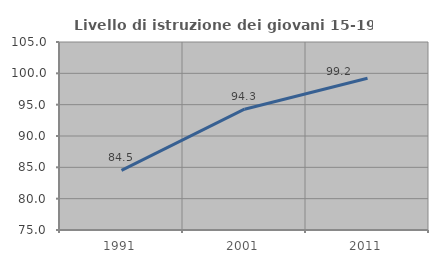
| Category | Livello di istruzione dei giovani 15-19 anni |
|---|---|
| 1991.0 | 84.505 |
| 2001.0 | 94.279 |
| 2011.0 | 99.204 |